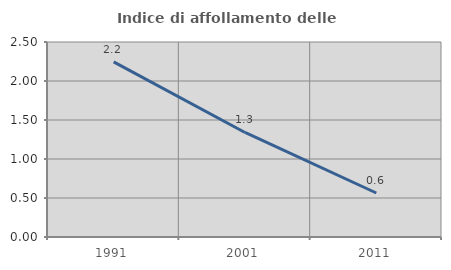
| Category | Indice di affollamento delle abitazioni  |
|---|---|
| 1991.0 | 2.245 |
| 2001.0 | 1.34 |
| 2011.0 | 0.564 |